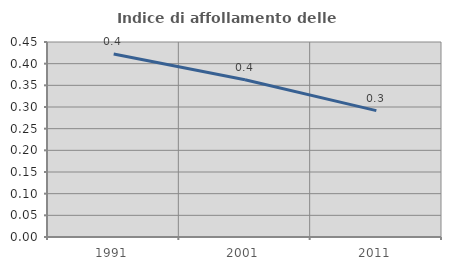
| Category | Indice di affollamento delle abitazioni  |
|---|---|
| 1991.0 | 0.422 |
| 2001.0 | 0.363 |
| 2011.0 | 0.292 |